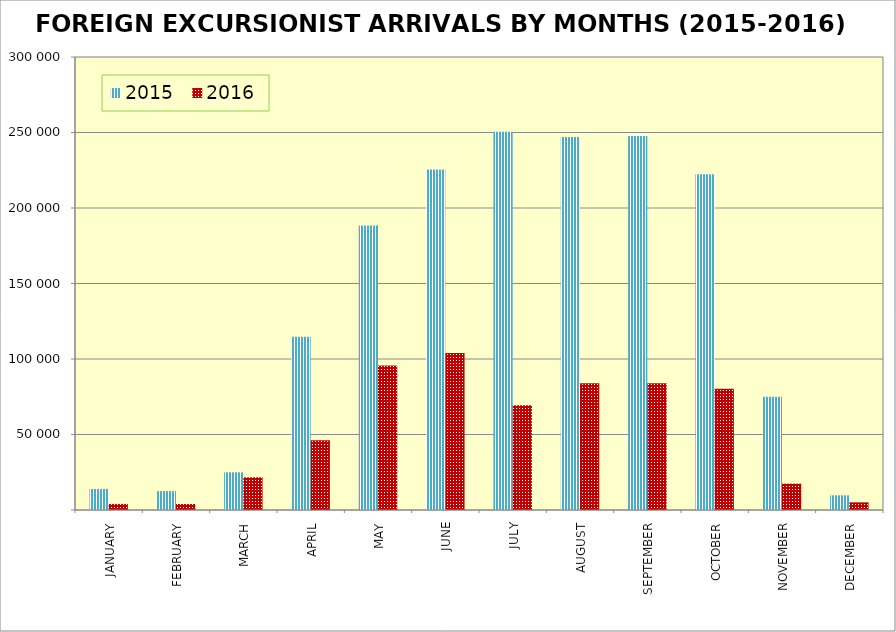
| Category | 2015 | 2016 |
|---|---|---|
| JANUARY | 13972 | 4025 |
| FEBRUARY | 12514 | 3958 |
| MARCH | 24947 | 21650 |
| APRIL | 114667 | 46238 |
| MAY | 188486 | 95724 |
| JUNE | 225570 | 104038 |
| JULY | 250525 | 69331 |
| AUGUST | 247028 | 83865 |
| SEPTEMBER | 247642 | 83882 |
| OCTOBER | 222348 | 80238 |
| NOVEMBER | 75033 | 17454 |
| DECEMBER | 9713 | 5074 |